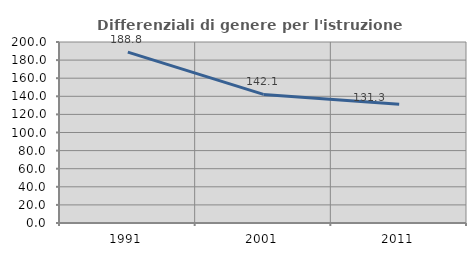
| Category | Differenziali di genere per l'istruzione superiore |
|---|---|
| 1991.0 | 188.839 |
| 2001.0 | 142.105 |
| 2011.0 | 131.274 |